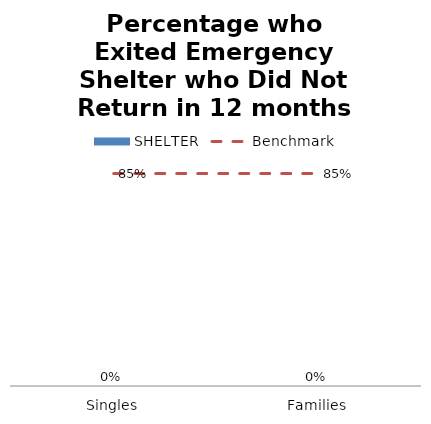
| Category | SHELTER  |
|---|---|
| Singles | 0 |
| Families | 0 |